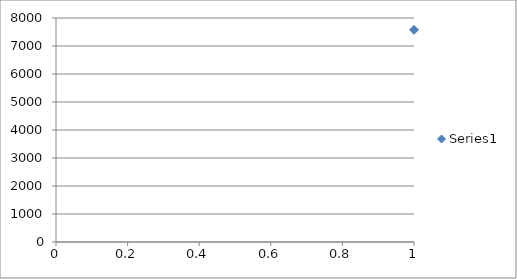
| Category | Series 0 |
|---|---|
| 0 | 7578.635 |
| 1 | 7578.635 |
| 2 | 7551.777 |
| 3 | 7551.777 |
| 4 | 7519.548 |
| 5 | 7508.805 |
| 6 | 7508.805 |
| 7 | 7480.156 |
| 8 | 7480.156 |
| 9 | 7464.042 |
| 10 | 7464.042 |
| 11 | 7464.042 |
| 12 | 7002.087 |
| 13 | 6937.628 |
| 14 | 6601.011 |
| 15 | 6588.477 |
| 16 | 6565.2 |
| 17 | 6522.228 |
| 18 | 6520.437 |
| 19 | 6504.322 |
| 20 | 6439.864 |
| 21 | 6439.864 |
| 22 | 6393.31 |
| 23 | 6393.31 |
| 24 | 6373.614 |
| 25 | 6346.756 |
| 26 | 6339.594 |
| 27 | 6336.013 |
| 28 | 6314.527 |
| 29 | 6250.068 |
| 30 | 6044.159 |
| 31 | 6017.301 |
| 32 | 5933.146 |
| 33 | 5899.126 |
| 34 | 5874.059 |
| 35 | 5852.573 |
| 36 | 5809.6 |
| 37 | 5807.81 |
| 38 | 5689.635 |
| 39 | 5625.177 |
| 40 | 5573.251 |
| 41 | 5451.496 |
| 42 | 5444.334 |
| 43 | 5408.523 |
| 44 | 5193.661 |
| 45 | 5134.574 |
| 46 | 5091.602 |
| 47 | 5032.514 |
| 48 | 5032.514 |
| 49 | 5032.514 |
| 50 | 4672.62 |
| 51 | 4590.256 |
| 52 | 4549.074 |
| 53 | 4196.341 |
| 54 | 4182.017 |
| 55 | 4182.017 |
| 56 | 4135.463 |
| 57 | 4135.463 |
| 58 | 4087.12 |
| 59 | 2337.781 |
| 60 | 2169.472 |
| 61 | 2156.938 |
| 62 | 1791.672 |
| 63 | 1342.251 |
| 64 | 1342.251 |
| 65 | 1327.927 |
| 66 | 1279.583 |
| 67 | 1279.583 |
| 68 | 1279.583 |
| 69 | 1256.306 |